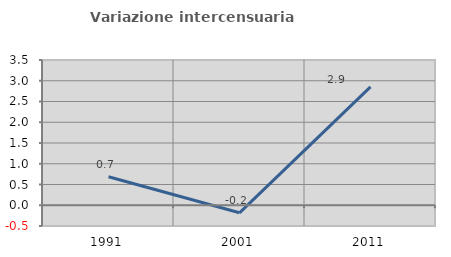
| Category | Variazione intercensuaria annua |
|---|---|
| 1991.0 | 0.687 |
| 2001.0 | -0.182 |
| 2011.0 | 2.851 |